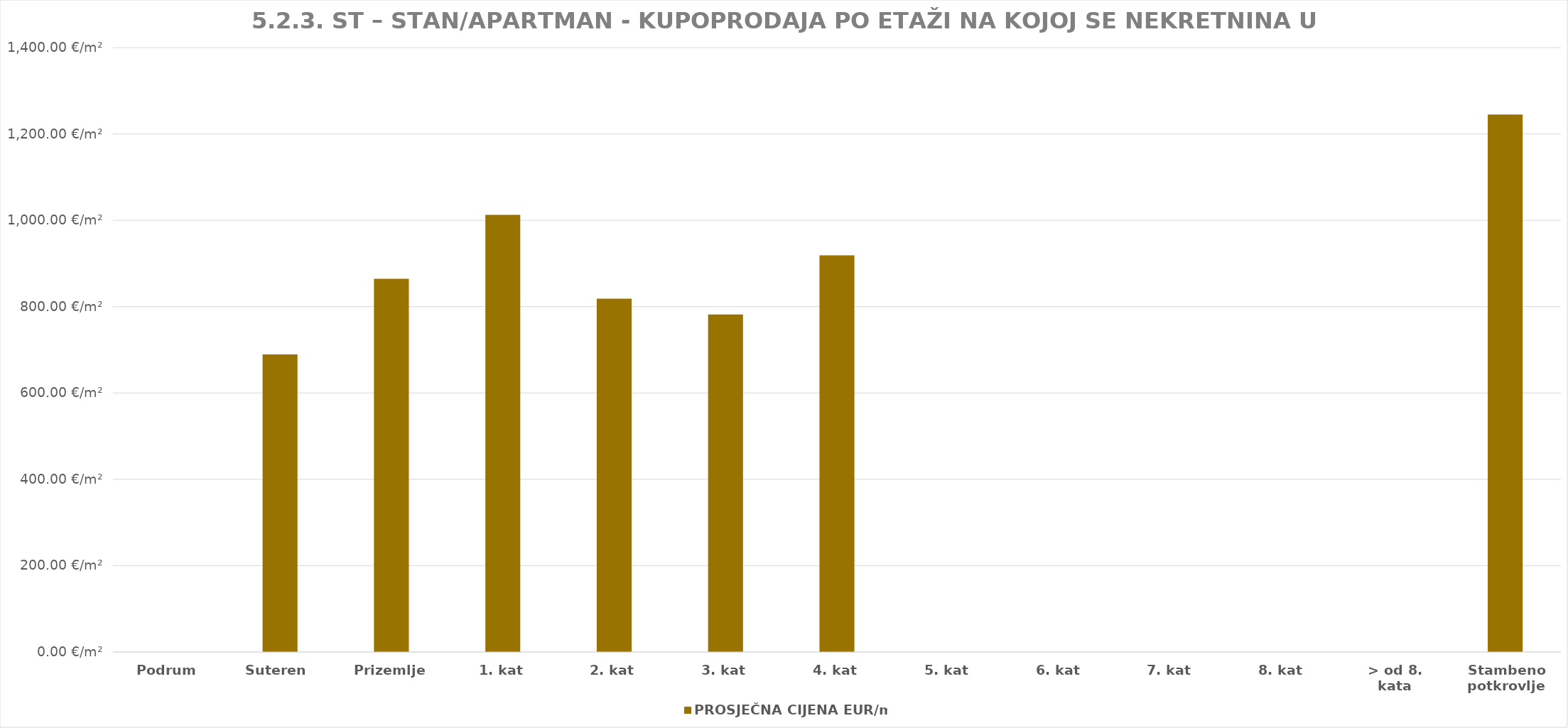
| Category | PROSJEČNA CIJENA EUR/m2 |
|---|---|
| Podrum | 0 |
| Suteren  | 1901-11-19 10:22:30 |
| Prizemlje | 1902-05-13 08:16:23 |
| 1. kat | 1902-10-08 11:18:17 |
| 2. kat | 1902-03-28 15:30:40 |
| 3. kat | 1902-02-19 17:34:18 |
| 4. kat | 1902-07-06 23:41:10 |
| 5. kat | 0 |
| 6. kat | 0 |
| 7. kat | 0 |
| 8. kat | 0 |
| > od 8. kata | 0 |
| Stambeno potkrovlje | 1903-05-28 23:08:35 |